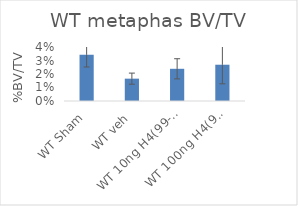
| Category | Series 0 |
|---|---|
| WT Sham | 0.034 |
| WT veh | 0.017 |
| WT 10ng H4(99-103) | 0.024 |
| WT 100ng H4(99-103) | 0.027 |